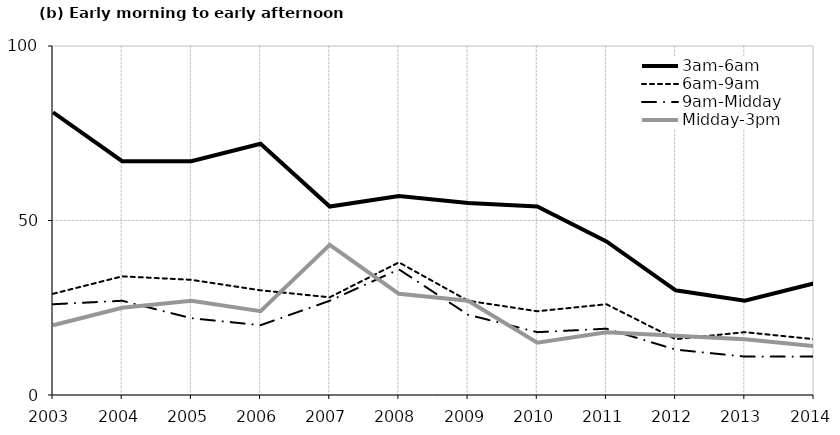
| Category | 3am-6am | 6am-9am | 9am-Midday | Midday-3pm |
|---|---|---|---|---|
| 2003.0 | 81 | 29 | 26 | 20 |
| 2004.0 | 67 | 34 | 27 | 25 |
| 2005.0 | 67 | 33 | 22 | 27 |
| 2006.0 | 72 | 30 | 20 | 24 |
| 2007.0 | 54 | 28 | 27 | 43 |
| 2008.0 | 57 | 38 | 36 | 29 |
| 2009.0 | 55 | 27 | 23 | 27 |
| 2010.0 | 54 | 24 | 18 | 15 |
| 2011.0 | 44 | 26 | 19 | 18 |
| 2012.0 | 30 | 16 | 13 | 17 |
| 2013.0 | 27 | 18 | 11 | 16 |
| 2014.0 | 32 | 16 | 11 | 14 |